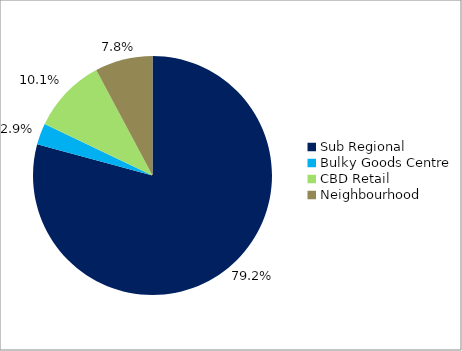
| Category | Series 0 |
|---|---|
| Sub Regional | 0.792 |
| Bulky Goods Centre | 0.029 |
| CBD Retail | 0.101 |
| Neighbourhood | 0.078 |